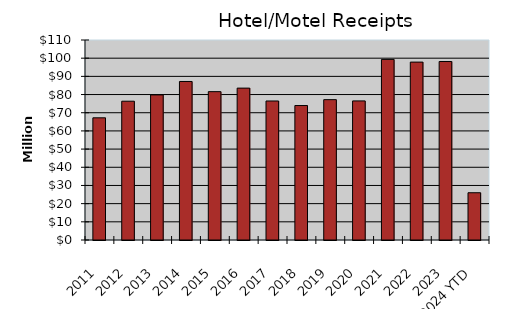
| Category | Series 0 |
|---|---|
| 2011 | 67197963 |
| 2012 | 76336383 |
| 2013 | 79800711 |
| 2014 | 87185566 |
| 2015 | 81591184 |
| 2016 | 83535139 |
| 2017 | 76451012 |
| 2018 | 73956500 |
| 2019 | 77195748 |
| 2020 | 76496166 |
| 2021 | 99331312 |
| 2022 | 97843808 |
| 2023 | 98164195 |
| 2024 YTD | 25991863 |